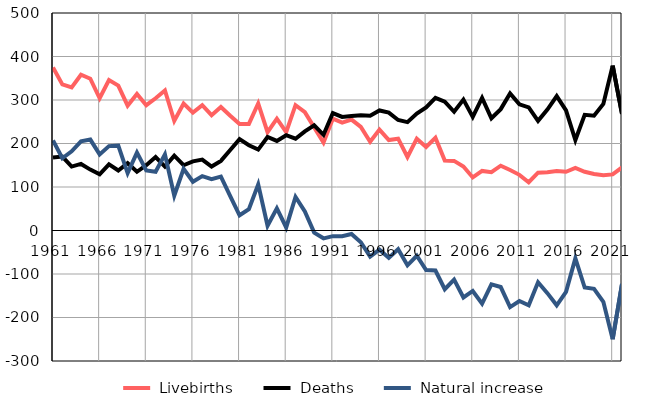
| Category |  Livebirths |  Deaths |  Natural increase |
|---|---|---|---|
| 1961.0 | 375 | 168 | 207 |
| 1962.0 | 336 | 170 | 166 |
| 1963.0 | 329 | 147 | 182 |
| 1964.0 | 358 | 153 | 205 |
| 1965.0 | 349 | 140 | 209 |
| 1966.0 | 304 | 129 | 175 |
| 1967.0 | 346 | 152 | 194 |
| 1968.0 | 333 | 138 | 195 |
| 1969.0 | 287 | 155 | 132 |
| 1970.0 | 314 | 135 | 179 |
| 1971.0 | 288 | 150 | 138 |
| 1972.0 | 304 | 169 | 135 |
| 1973.0 | 322 | 147 | 175 |
| 1974.0 | 252 | 172 | 80 |
| 1975.0 | 292 | 150 | 142 |
| 1976.0 | 271 | 159 | 112 |
| 1977.0 | 288 | 163 | 125 |
| 1978.0 | 265 | 147 | 118 |
| 1979.0 | 284 | 160 | 124 |
| 1980.0 | 264 | 185 | 79 |
| 1981.0 | 245 | 210 | 35 |
| 1982.0 | 245 | 196 | 49 |
| 1983.0 | 292 | 186 | 106 |
| 1984.0 | 226 | 215 | 11 |
| 1985.0 | 257 | 206 | 51 |
| 1986.0 | 226 | 219 | 7 |
| 1987.0 | 288 | 211 | 77 |
| 1988.0 | 272 | 228 | 44 |
| 1989.0 | 237 | 242 | -5 |
| 1990.0 | 202 | 220 | -18 |
| 1991.0 | 257 | 270 | -13 |
| 1992.0 | 248 | 261 | -13 |
| 1993.0 | 255 | 263 | -8 |
| 1994.0 | 238 | 265 | -27 |
| 1995.0 | 204 | 264 | -60 |
| 1996.0 | 232 | 276 | -44 |
| 1997.0 | 208 | 271 | -63 |
| 1998.0 | 211 | 254 | -43 |
| 1999.0 | 169 | 249 | -80 |
| 2000.0 | 211 | 269 | -58 |
| 2001.0 | 192 | 283 | -91 |
| 2002.0 | 213 | 305 | -92 |
| 2003.0 | 161 | 296 | -135 |
| 2004.0 | 160 | 273 | -113 |
| 2005.0 | 147 | 301 | -154 |
| 2006.0 | 122 | 261 | -139 |
| 2007.0 | 137 | 305 | -168 |
| 2008.0 | 134 | 258 | -124 |
| 2009.0 | 149 | 279 | -130 |
| 2010.0 | 139 | 315 | -176 |
| 2011.0 | 128 | 290 | -162 |
| 2012.0 | 111 | 283 | -172 |
| 2013.0 | 133 | 252 | -119 |
| 2014.0 | 134 | 278 | -144 |
| 2015.0 | 137 | 309 | -172 |
| 2016.0 | 135 | 276 | -141 |
| 2017.0 | 144 | 208 | -64 |
| 2018.0 | 135 | 266 | -131 |
| 2019.0 | 130 | 264 | -134 |
| 2020.0 | 127 | 291 | -164 |
| 2021.0 | 129 | 379 | -250 |
| 2022.0 | 145 | 268 | -123 |